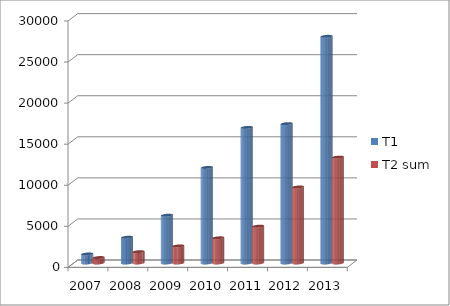
| Category | T1 | T2 sum |
|---|---|---|
| 2007.0 | 1100 | 665 |
| 2008.0 | 3136 | 1379 |
| 2009.0 | 5822 | 2085.5 |
| 2010.0 | 11637 | 3066.75 |
| 2011.0 | 16509 | 4481.125 |
| 2012.0 | 16964.8 | 9255 |
| 2013.0 | 27600 | 12888 |